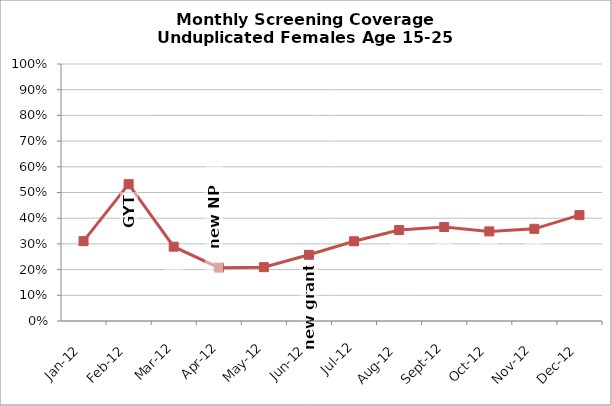
| Category | Screening Coverage |
|---|---|
| 2012-01-01 | 0.311 |
| 2012-02-01 | 0.532 |
| 2012-03-01 | 0.289 |
| 2012-04-01 | 0.208 |
| 2012-05-01 | 0.209 |
| 2012-06-01 | 0.258 |
| 2012-07-01 | 0.31 |
| 2012-08-01 | 0.354 |
| 2012-09-01 | 0.366 |
| 2012-10-01 | 0.349 |
| 2012-11-01 | 0.359 |
| 2012-12-01 | 0.412 |